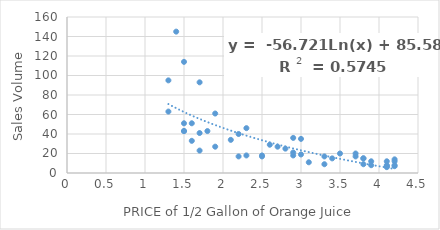
| Category | Sales Volume |
|---|---|
| 1.5 | 43 |
| 3.9 | 12 |
| 3.8 | 15 |
| 1.9 | 27 |
| 4.2 | 8 |
| 4.1 | 12 |
| 2.7 | 27 |
| 2.2 | 17 |
| 1.9 | 61 |
| 3.7 | 20 |
| 1.3 | 95 |
| 1.6 | 33 |
| 3.0 | 19 |
| 3.8 | 15 |
| 1.5 | 43 |
| 3.1 | 11 |
| 3.5 | 20 |
| 2.9 | 36 |
| 4.1 | 7 |
| 3.3 | 9 |
| 2.9 | 21 |
| 2.8 | 25 |
| 2.6 | 29 |
| 2.3 | 18 |
| 4.1 | 6 |
| 4.2 | 7 |
| 3.4 | 15 |
| 1.7 | 23 |
| 1.6 | 51 |
| 1.7 | 93 |
| 1.5 | 51 |
| 4.2 | 14 |
| 1.7 | 41 |
| 3.9 | 8 |
| 1.5 | 114 |
| 3.0 | 35 |
| 2.5 | 18 |
| 3.8 | 9 |
| 2.3 | 46 |
| 2.5 | 17 |
| 1.8 | 43 |
| 1.3 | 63 |
| 4.1 | 8 |
| 2.1 | 34 |
| 1.4 | 145 |
| 2.9 | 18 |
| 2.2 | 40 |
| 3.3 | 17 |
| 3.7 | 17 |
| 4.2 | 12 |